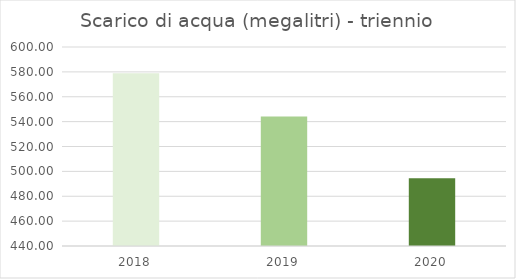
| Category | SCARICO DI ACQUA (megalitri) |
|---|---|
| 0 | 578.86 |
| 1 | 544.16 |
| 2 | 494.45 |